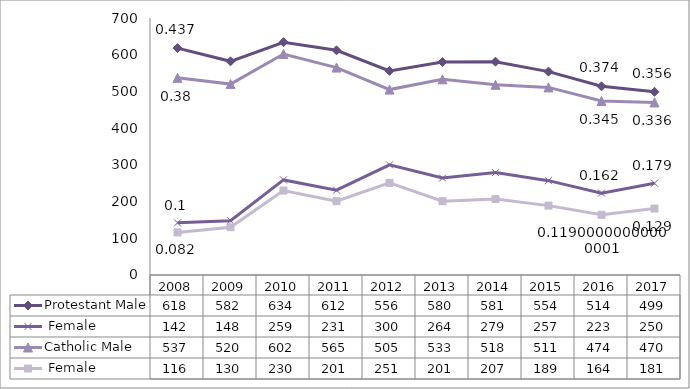
| Category | Protestant | Catholic |
|---|---|---|
| 2008.0 | 142 | 116 |
| 2009.0 | 148 | 130 |
| 2010.0 | 259 | 230 |
| 2011.0 | 231 | 201 |
| 2012.0 | 300 | 251 |
| 2013.0 | 264 | 201 |
| 2014.0 | 279 | 207 |
| 2015.0 | 257 | 189 |
| 2016.0 | 223 | 164 |
| 2017.0 | 250 | 181 |